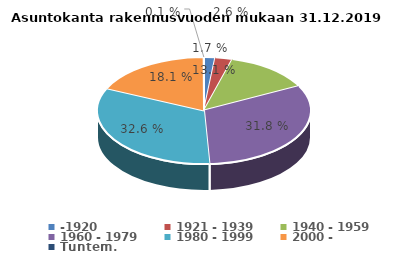
| Category | Series 0 |
|---|---|
| -1920 | 1.694 |
| 1921 - 1939 | 2.603 |
| 1940 - 1959 | 13.132 |
| 1960 - 1979 | 31.753 |
| 1980 - 1999 | 32.639 |
| 2000 - | 18.129 |
| Tuntem. | 0.05 |